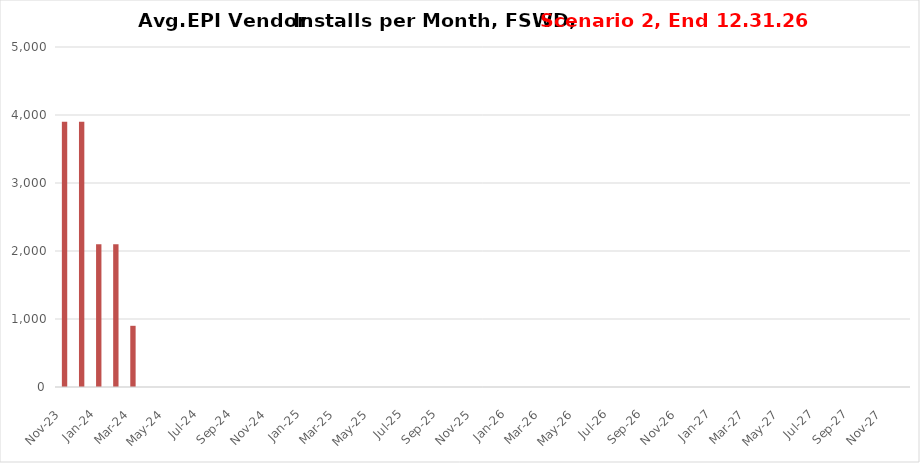
| Category | Series 1 |
|---|---|
| 2023-11-01 | 3900 |
| 2023-12-01 | 3900 |
| 2024-01-01 | 2100 |
| 2024-02-01 | 2100 |
| 2024-03-01 | 900 |
| 2024-04-01 | 0 |
| 2024-05-01 | 0 |
| 2024-06-01 | 0 |
| 2024-07-01 | 0 |
| 2024-08-01 | 0 |
| 2024-09-01 | 0 |
| 2024-10-01 | 0 |
| 2024-11-01 | 0 |
| 2024-12-01 | 0 |
| 2025-01-01 | 0 |
| 2025-02-01 | 0 |
| 2025-03-01 | 0 |
| 2025-04-01 | 0 |
| 2025-05-01 | 0 |
| 2025-06-01 | 0 |
| 2025-07-01 | 0 |
| 2025-08-01 | 0 |
| 2025-09-01 | 0 |
| 2025-10-01 | 0 |
| 2025-11-01 | 0 |
| 2025-12-01 | 0 |
| 2026-01-01 | 0 |
| 2026-02-01 | 0 |
| 2026-03-01 | 0 |
| 2026-04-01 | 0 |
| 2026-05-01 | 0 |
| 2026-06-01 | 0 |
| 2026-07-01 | 0 |
| 2026-08-01 | 0 |
| 2026-09-01 | 0 |
| 2026-10-01 | 0 |
| 2026-11-01 | 0 |
| 2026-12-01 | 0 |
| 2027-01-01 | 0 |
| 2027-02-01 | 0 |
| 2027-03-01 | 0 |
| 2027-04-01 | 0 |
| 2027-05-01 | 0 |
| 2027-06-01 | 0 |
| 2027-07-01 | 0 |
| 2027-08-01 | 0 |
| 2027-09-01 | 0 |
| 2027-10-01 | 0 |
| 2027-11-01 | 0 |
| 2027-12-01 | 0 |